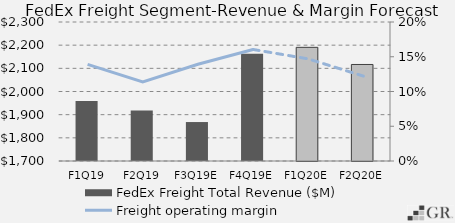
| Category | FedEx Freight Total Revenue ($M) |
|---|---|
|  F1Q19  | 1959.025 |
|  F2Q19  | 1917.798 |
|  F3Q19E  | 1868.171 |
|  F4Q19E  | 2163.205 |
|  F1Q20E  | 2190.616 |
|  F2Q20E  | 2116.67 |